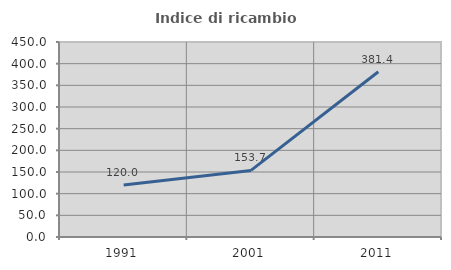
| Category | Indice di ricambio occupazionale  |
|---|---|
| 1991.0 | 120 |
| 2001.0 | 153.704 |
| 2011.0 | 381.416 |